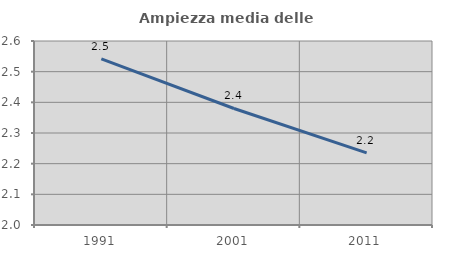
| Category | Ampiezza media delle famiglie |
|---|---|
| 1991.0 | 2.542 |
| 2001.0 | 2.38 |
| 2011.0 | 2.235 |